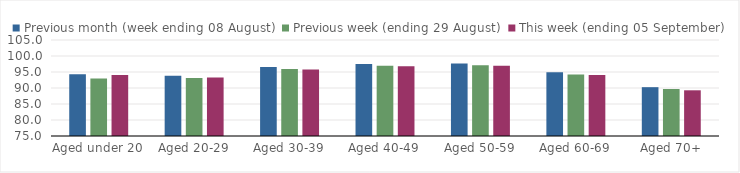
| Category | Previous month (week ending 08 August) | Previous week (ending 29 August) | This week (ending 05 September) |
|---|---|---|---|
| Aged under 20 | 94.32 | 92.97 | 94.04 |
| Aged 20-29 | 93.84 | 93.15 | 93.3 |
| Aged 30-39 | 96.53 | 95.95 | 95.8 |
| Aged 40-49 | 97.47 | 96.96 | 96.78 |
| Aged 50-59 | 97.63 | 97.08 | 96.99 |
| Aged 60-69 | 94.92 | 94.23 | 94.09 |
| Aged 70+ | 90.26 | 89.68 | 89.28 |